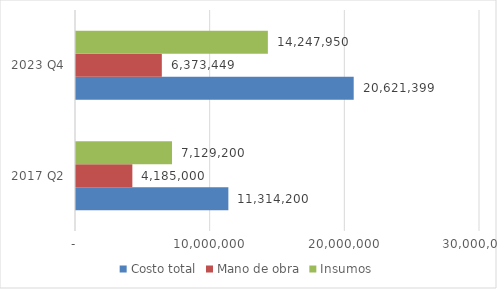
| Category | Costo total | Mano de obra | Insumos |
|---|---|---|---|
| 2017 Q2 | 11314200 | 4185000 | 7129200 |
| 2023 Q4 | 20621398.81 | 6373449 | 14247949.81 |